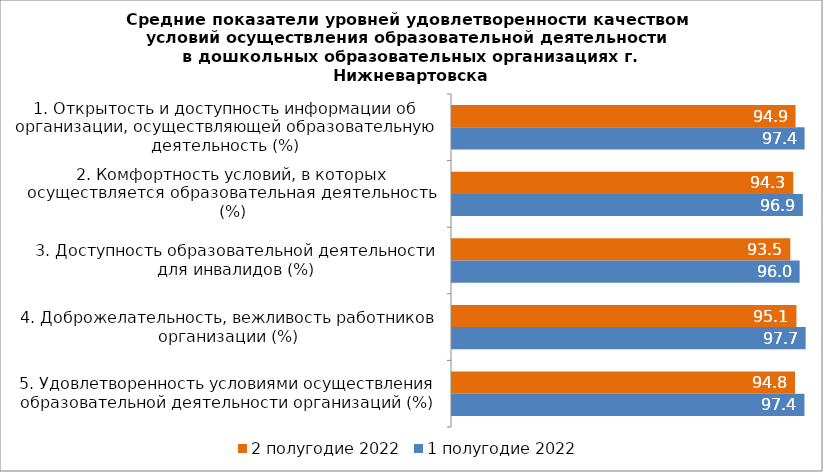
| Category | 2 полугодие 2022 | 1 полугодие 2022 |
|---|---|---|
| 1. Открытость и доступность информации об организации, осуществляющей образовательную деятельность (%) | 94.902 | 97.402 |
| 2. Комфортность условий, в которых осуществляется образовательная деятельность (%) | 94.276 | 96.929 |
| 3. Доступность образовательной деятельности для инвалидов (%) | 93.461 | 96.028 |
| 4. Доброжелательность, вежливость работников организации (%) | 95.148 | 97.691 |
| 5. Удовлетворенность условиями осуществления образовательной деятельности организаций (%) | 94.754 | 97.361 |